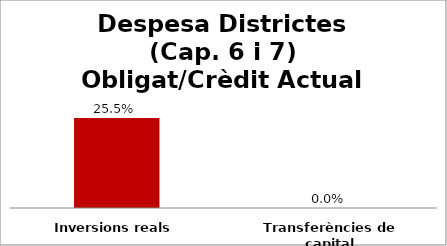
| Category | Series 0 |
|---|---|
| Inversions reals | 0.255 |
| Transferències de capital | 0 |